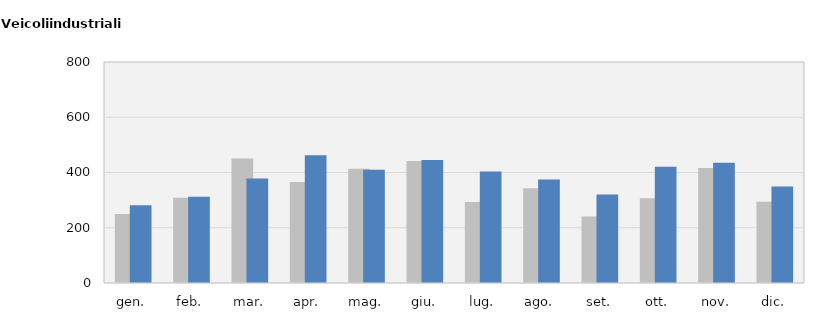
| Category | 2017 | 2018 |
|---|---|---|
| gen. | 250 | 281 |
| feb. | 309 | 312 |
| mar. | 451 | 378 |
| apr. | 366 | 462 |
| mag. | 414 | 410 |
| giu. | 442 | 445 |
| lug. | 293 | 404 |
| ago. | 343 | 375 |
| set. | 241 | 320 |
| ott. | 307 | 421 |
| nov. | 416 | 435 |
| dic. | 294 | 349 |